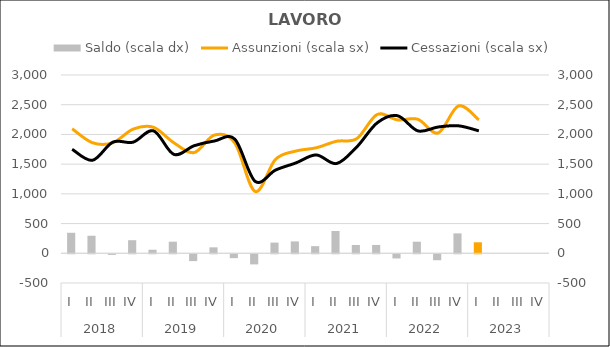
| Category | Saldo (scala dx) |
|---|---|
| 0 | 345 |
| 1 | 295 |
| 2 | -10 |
| 3 | 220 |
| 4 | 60 |
| 5 | 195 |
| 6 | -115 |
| 7 | 100 |
| 8 | -65 |
| 9 | -170 |
| 10 | 180 |
| 11 | 200 |
| 12 | 120 |
| 13 | 375 |
| 14 | 140 |
| 15 | 140 |
| 16 | -70 |
| 17 | 195 |
| 18 | -100 |
| 19 | 335 |
| 20 | 185 |
| 21 | 0 |
| 22 | 0 |
| 23 | 0 |